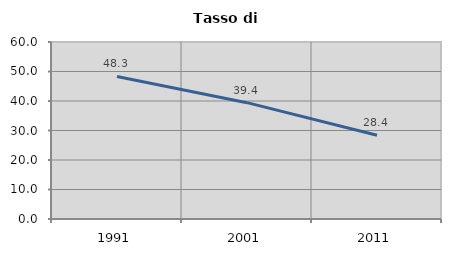
| Category | Tasso di disoccupazione   |
|---|---|
| 1991.0 | 48.307 |
| 2001.0 | 39.437 |
| 2011.0 | 28.398 |